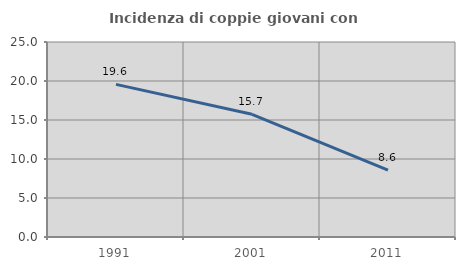
| Category | Incidenza di coppie giovani con figli |
|---|---|
| 1991.0 | 19.565 |
| 2001.0 | 15.733 |
| 2011.0 | 8.577 |